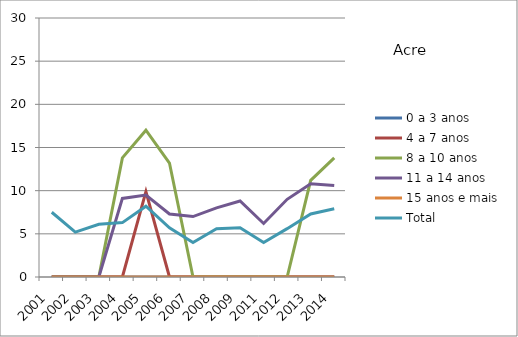
| Category | 0 a 3 anos | 4 a 7 anos | 8 a 10 anos | 11 a 14 anos | 15 anos e mais | Total |
|---|---|---|---|---|---|---|
| 2001.0 | 0 | 0 | 0 | 0 | 0 | 7.5 |
| 2002.0 | 0 | 0 | 0 | 0 | 0 | 5.2 |
| 2003.0 | 0 | 0 | 0 | 0 | 0 | 6.1 |
| 2004.0 | 0 | 0 | 13.8 | 9.1 | 0 | 6.3 |
| 2005.0 | 0 | 9.9 | 17 | 9.5 | 0 | 8.2 |
| 2006.0 | 0 | 0 | 13.2 | 7.3 | 0 | 5.7 |
| 2007.0 | 0 | 0 | 0 | 7 | 0 | 4 |
| 2008.0 | 0 | 0 | 0 | 8 | 0 | 5.6 |
| 2009.0 | 0 | 0 | 0 | 8.8 | 0 | 5.7 |
| 2011.0 | 0 | 0 | 0 | 6.2 | 0 | 4 |
| 2012.0 | 0 | 0 | 0 | 9 | 0 | 5.6 |
| 2013.0 | 0 | 0 | 11.2 | 10.8 | 0 | 7.3 |
| 2014.0 | 0 | 0 | 13.8 | 10.6 | 0 | 7.9 |